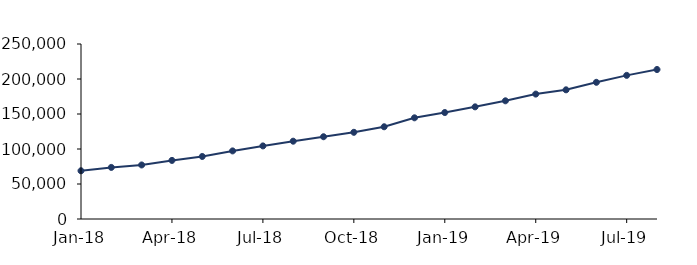
| Category | Series 1 |
|---|---|
| 2018-01-01 | 68902 |
| 2018-02-01 | 73690 |
| 2018-03-01 | 77192 |
| 2018-04-01 | 83705 |
| 2018-05-01 | 89326 |
| 2018-06-01 | 97277 |
| 2018-07-01 | 104398 |
| 2018-08-01 | 111144 |
| 2018-09-01 | 117525 |
| 2018-10-01 | 123852 |
| 2018-11-01 | 131763 |
| 2018-12-01 | 144557 |
| 2019-01-01 | 152087 |
| 2019-02-01 | 160208 |
| 2019-03-01 | 168849 |
| 2019-04-01 | 178459 |
| 2019-05-01 | 184537 |
| 2019-06-01 | 195266 |
| 2019-07-01 | 205187 |
| 2019-08-01 | 213557 |